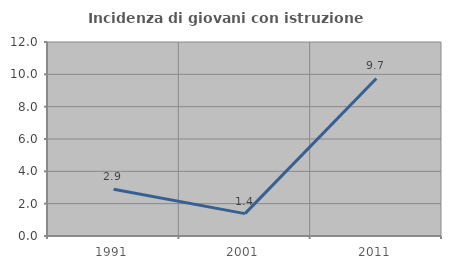
| Category | Incidenza di giovani con istruzione universitaria |
|---|---|
| 1991.0 | 2.89 |
| 2001.0 | 1.384 |
| 2011.0 | 9.746 |